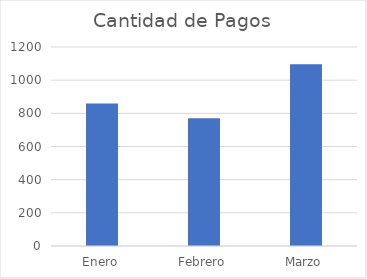
| Category | Cantidad de Pagos |
|---|---|
| Enero | 859 |
| Febrero | 771 |
| Marzo | 1096 |